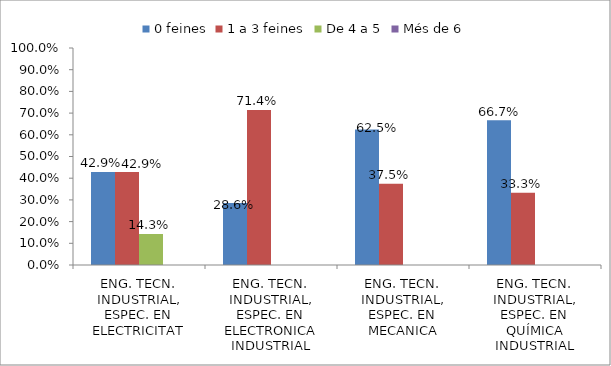
| Category | 0 feines | 1 a 3 feines | De 4 a 5 | Més de 6 |
|---|---|---|---|---|
| ENG. TECN. INDUSTRIAL, ESPEC. EN ELECTRICITAT | 0.429 | 0.429 | 0.143 | 0 |
| ENG. TECN. INDUSTRIAL, ESPEC. EN ELECTRONICA INDUSTRIAL | 0.286 | 0.714 | 0 | 0 |
| ENG. TECN. INDUSTRIAL, ESPEC. EN MECANICA | 0.625 | 0.375 | 0 | 0 |
| ENG. TECN. INDUSTRIAL, ESPEC. EN QUÍMICA INDUSTRIAL | 0.667 | 0.333 | 0 | 0 |